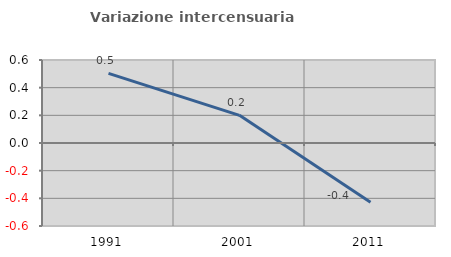
| Category | Variazione intercensuaria annua |
|---|---|
| 1991.0 | 0.503 |
| 2001.0 | 0.2 |
| 2011.0 | -0.429 |